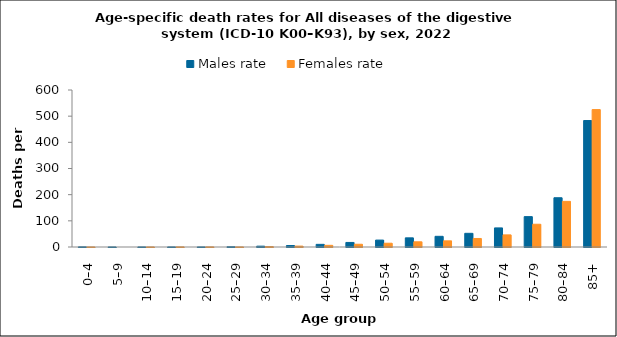
| Category | Males rate | Females rate |
|---|---|---|
| 0–4 | 0.515 | 0.136 |
| 5–9 | 0.121 | 0 |
| 10–14 | 0.238 | 0.126 |
| 15–19 | 0.253 | 0.404 |
| 20–24 | 0.236 | 0.379 |
| 25–29 | 0.973 | 0.222 |
| 30–34 | 3.166 | 1.653 |
| 35–39 | 5.636 | 3.459 |
| 40–44 | 10.098 | 6.373 |
| 45–49 | 17.433 | 10.495 |
| 50–54 | 26.416 | 14.409 |
| 55–59 | 34.989 | 19.864 |
| 60–64 | 40.798 | 23.471 |
| 65–69 | 52.286 | 32.563 |
| 70–74 | 72.937 | 46.316 |
| 75–79 | 116.081 | 86.971 |
| 80–84 | 188.254 | 174.319 |
| 85+ | 483.275 | 525.11 |